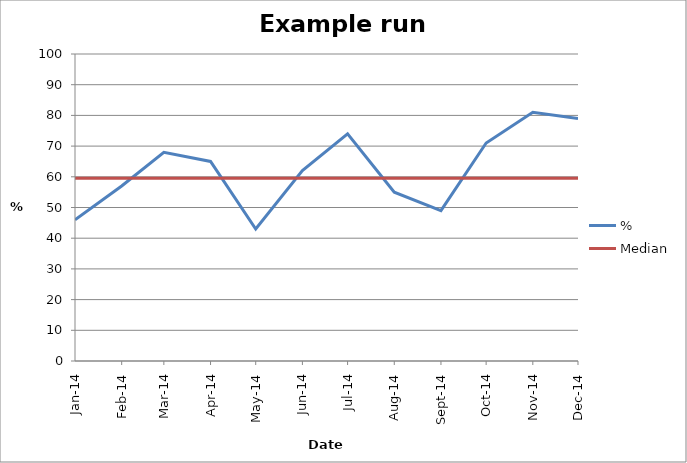
| Category | % | Median |
|---|---|---|
| 2014-01-01 | 46 | 59.5 |
| 2014-02-01 | 57 | 59.5 |
| 2014-03-01 | 68 | 59.5 |
| 2014-04-01 | 65 | 59.5 |
| 2014-05-01 | 43 | 59.5 |
| 2014-06-01 | 62 | 59.5 |
| 2014-07-01 | 74 | 59.5 |
| 2014-08-01 | 55 | 59.5 |
| 2014-09-01 | 49 | 59.5 |
| 2014-10-01 | 71 | 59.5 |
| 2014-11-01 | 81 | 59.5 |
| 2014-12-01 | 79 | 59.5 |